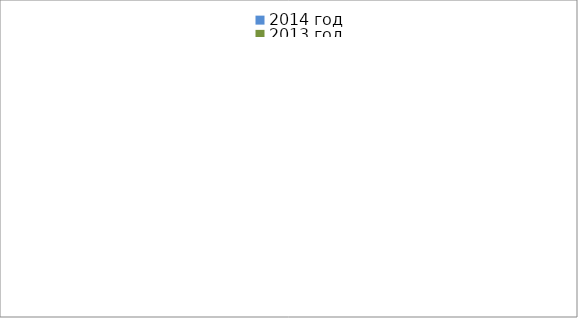
| Category | 2014 год | 2013 год |
|---|---|---|
|  - поджог | 19 | 34 |
|  - неосторожное обращение с огнём | 49 | 54 |
|  - НПТЭ электрооборудования | 18 | 22 |
|  - НПУ и Э печей | 63 | 52 |
|  - НПУ и Э транспортных средств | 57 | 52 |
|   -Шалость с огнем детей | 0 | 3 |
|  -НППБ при эксплуатации эл.приборов | 19 | 26 |
|  - курение | 19 | 12 |
| - прочие | 80 | 72 |
| - не установленные причины | 7 | 2 |